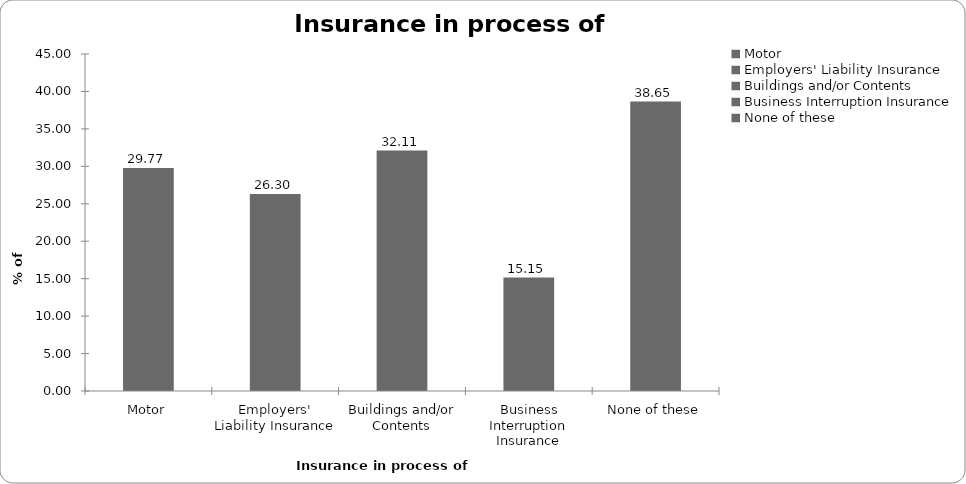
| Category | Insurance in process of buying |
|---|---|
| Motor | 29.773 |
| Employers' Liability Insurance | 26.302 |
| Buildings and/or Contents | 32.109 |
| Business Interruption Insurance | 15.154 |
| None of these | 38.652 |